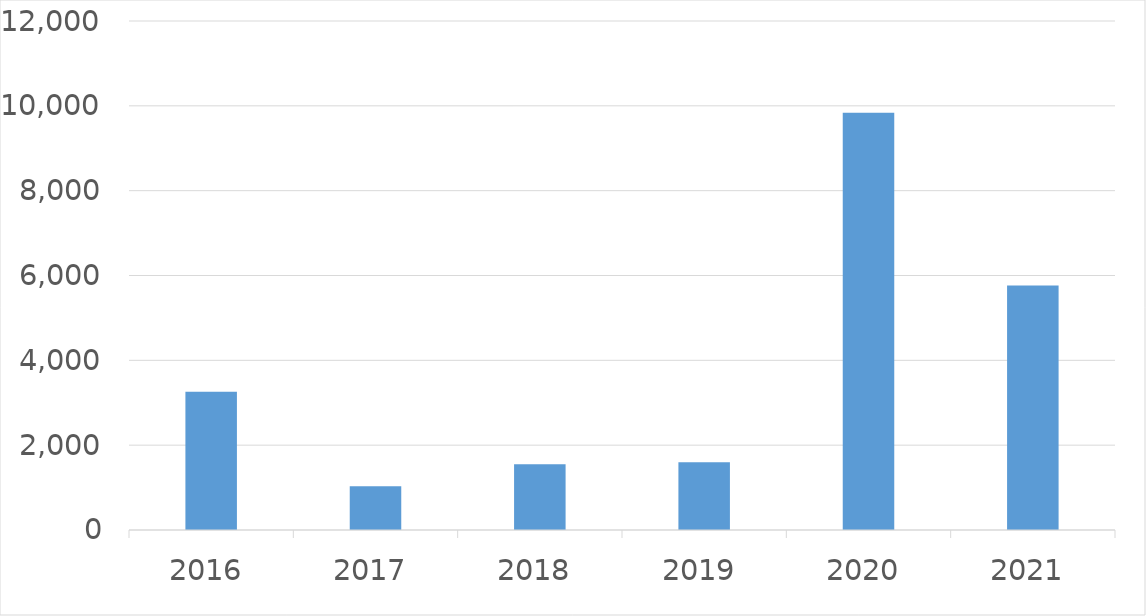
| Category | Series 0 |
|---|---|
| 2016 | 3257 |
| 2017 | 1029 |
| 2018 | 1552 |
| 2019 | 1600 |
| 2020 | 9835 |
| 2021 | 5767 |